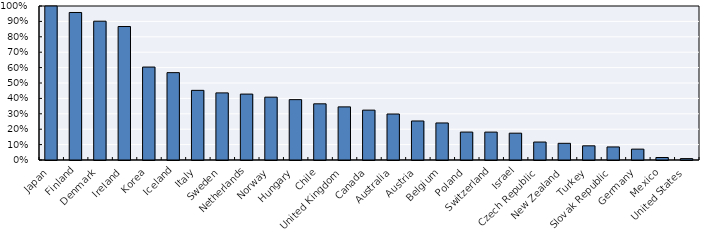
| Category | sh_job_creation |
|---|---|
| Japan | 100 |
| Finland | 95.785 |
| Denmark | 90.136 |
| Ireland | 86.674 |
| Korea | 60.354 |
| Iceland | 56.731 |
| Italy | 45.223 |
| Sweden | 43.58 |
| Netherlands | 42.805 |
| Norway | 40.807 |
| Hungary | 39.2 |
| Chile | 36.482 |
| United Kingdom | 34.494 |
| Canada | 32.383 |
| Australia | 29.864 |
| Austria | 25.342 |
| Belgium | 24.047 |
| Poland | 18.137 |
| Switzerland | 18.111 |
| Israel | 17.417 |
| Czech Republic | 11.662 |
| New Zealand | 10.832 |
| Turkey | 9.208 |
| Slovak Republic | 8.478 |
| Germany | 7.053 |
| Mexico | 1.621 |
| United States | 0.907 |